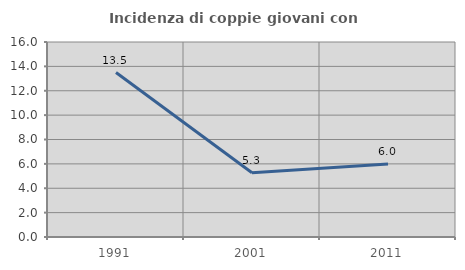
| Category | Incidenza di coppie giovani con figli |
|---|---|
| 1991.0 | 13.492 |
| 2001.0 | 5.274 |
| 2011.0 | 5.987 |